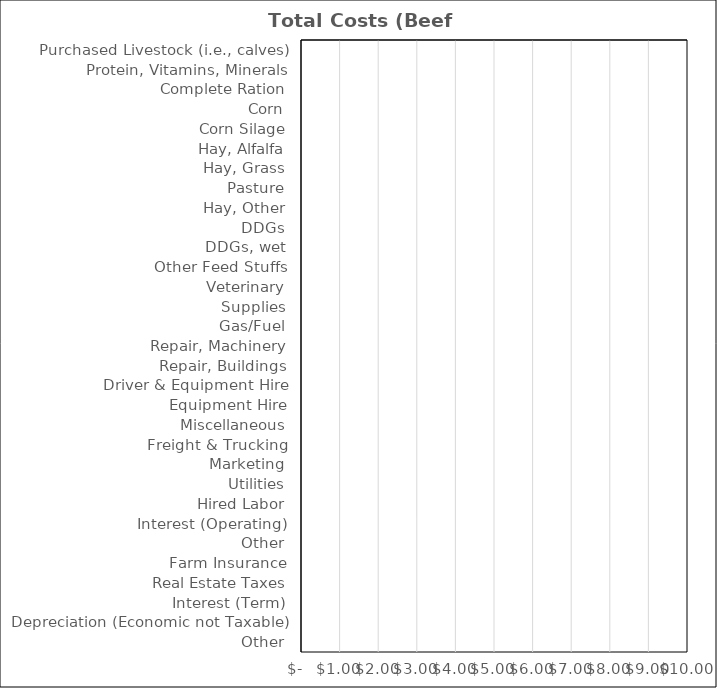
| Category | Beef Finishing |
|---|---|
| Purchased Livestock (i.e., calves) | 0 |
| Protein, Vitamins, Minerals | 0 |
| Complete Ration | 0 |
| Corn | 0 |
| Corn Silage | 0 |
| Hay, Alfalfa | 0 |
| Hay, Grass | 0 |
| Pasture | 0 |
| Hay, Other | 0 |
| DDGs | 0 |
| DDGs, wet | 0 |
| Other Feed Stuffs | 0 |
| Veterinary | 0 |
| Supplies | 0 |
| Gas/Fuel | 0 |
| Repair, Machinery | 0 |
| Repair, Buildings | 0 |
| Driver & Equipment Hire | 0 |
| Equipment Hire | 0 |
| Miscellaneous | 0 |
| Freight & Trucking | 0 |
| Marketing | 0 |
| Utilities | 0 |
| Hired Labor | 0 |
| Interest (Operating) | 0 |
| Other | 0 |
| Farm Insurance | 0 |
| Real Estate Taxes | 0 |
| Interest (Term) | 0 |
| Depreciation (Economic not Taxable) | 0 |
| Other | 0 |